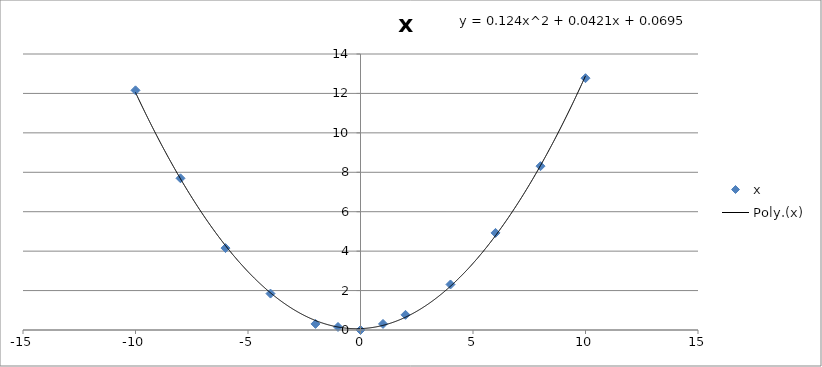
| Category | x |
|---|---|
| 10.0 | 12.773 |
| 8.0 | 8.31 |
| 6.0 | 4.925 |
| 4.0 | 2.308 |
| 2.0 | 0.769 |
| 1.0 | 0.308 |
| 0.0 | 0 |
| -1.0 | 0.154 |
| -2.0 | 0.308 |
| -4.0 | 1.847 |
| -6.0 | 4.155 |
| -8.0 | 7.695 |
| -10.0 | 12.158 |